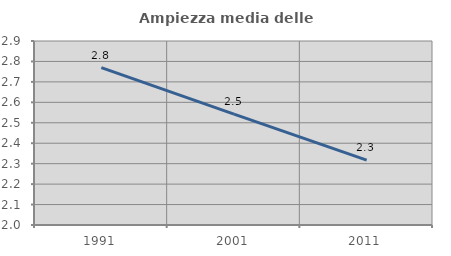
| Category | Ampiezza media delle famiglie |
|---|---|
| 1991.0 | 2.77 |
| 2001.0 | 2.542 |
| 2011.0 | 2.317 |